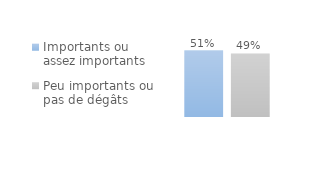
| Category | Importants ou assez importants | Peu importants ou pas de dégâts |
|---|---|---|
| 0 | 0.511 | 0.489 |